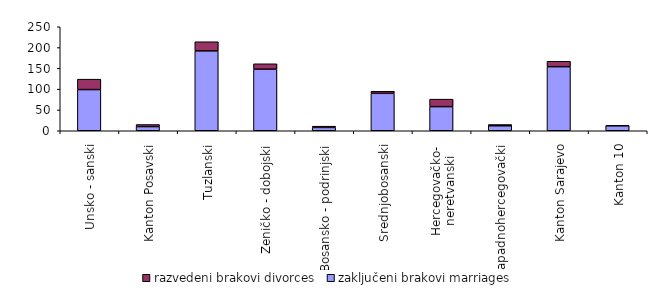
| Category | zaključeni brakovi marriages | razvedeni brakovi divorces |
|---|---|---|
| Unsko - sanski | 99 | 25 |
| Kanton Posavski | 10 | 5 |
| Tuzlanski | 192 | 22 |
| Zeničko - dobojski | 148 | 13 |
| Bosansko - podrinjski | 8 | 3 |
| Srednjobosanski | 90 | 5 |
| Hercegovačko-
neretvanski | 58 | 18 |
| Zapadnohercegovački | 12 | 3 |
| Kanton Sarajevo | 154 | 13 |
| Kanton 10 | 12 | 1 |